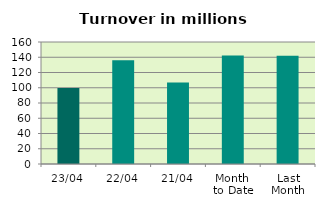
| Category | Series 0 |
|---|---|
| 23/04 | 99.629 |
| 22/04 | 136.161 |
| 21/04 | 106.9 |
| Month 
to Date | 142.216 |
| Last
Month | 142.086 |